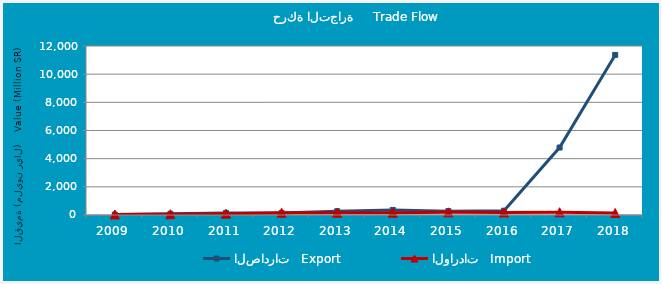
| Category | الصادرات   Export | الواردات   Import |
|---|---|---|
| 2009.0 | 29819267 | 39526292 |
| 2010.0 | 81765687 | 57386470 |
| 2011.0 | 145423099 | 93556009 |
| 2012.0 | 144914096 | 164520507 |
| 2013.0 | 269248895 | 161808777 |
| 2014.0 | 360455721 | 164735509 |
| 2015.0 | 275052830 | 188841995 |
| 2016.0 | 303911644 | 180918657 |
| 2017.0 | 4789186055 | 196362692 |
| 2018.0 | 11367690155 | 142249996 |